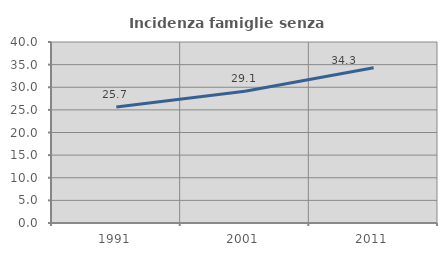
| Category | Incidenza famiglie senza nuclei |
|---|---|
| 1991.0 | 25.65 |
| 2001.0 | 29.119 |
| 2011.0 | 34.302 |